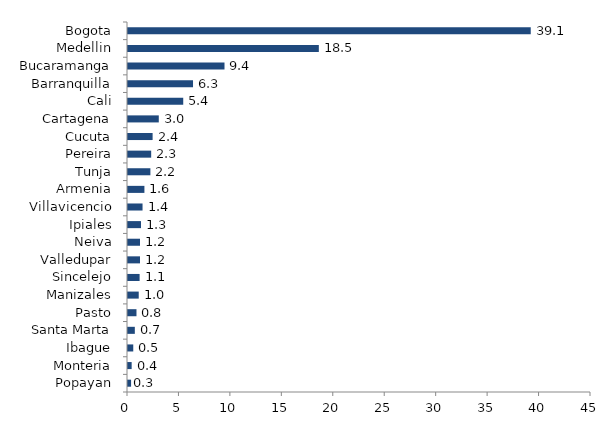
| Category | Series 0 |
|---|---|
| Popayan | 0.299 |
| Monteria | 0.355 |
| Ibague | 0.511 |
| Santa Marta | 0.663 |
| Pasto | 0.824 |
| Manizales | 1.043 |
| Sincelejo | 1.129 |
| Valledupar | 1.166 |
| Neiva | 1.167 |
| Ipiales | 1.261 |
| Villavicencio | 1.414 |
| Armenia | 1.595 |
| Tunja | 2.177 |
| Pereira | 2.253 |
| Cucuta | 2.392 |
| Cartagena | 2.992 |
| Cali | 5.368 |
| Barranquilla | 6.319 |
| Bucaramanga | 9.379 |
| Medellin | 18.547 |
| Bogota | 39.144 |